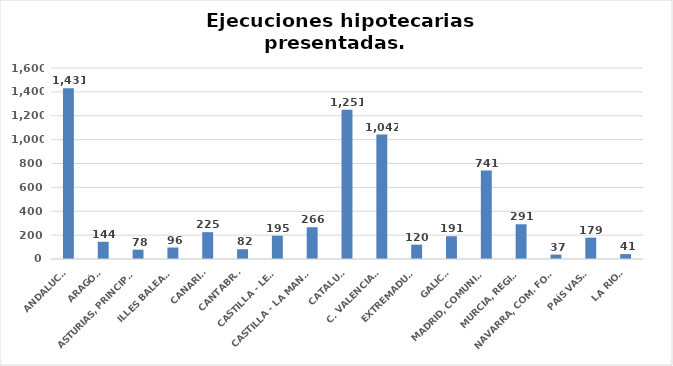
| Category | Series 0 |
|---|---|
| ANDALUCÍA | 1431 |
| ARAGÓN | 144 |
| ASTURIAS, PRINCIPADO | 78 |
| ILLES BALEARS | 96 |
| CANARIAS | 225 |
| CANTABRIA | 82 |
| CASTILLA - LEÓN | 195 |
| CASTILLA - LA MANCHA | 266 |
| CATALUÑA | 1251 |
| C. VALENCIANA | 1042 |
| EXTREMADURA | 120 |
| GALICIA | 191 |
| MADRID, COMUNIDAD | 741 |
| MURCIA, REGIÓN | 291 |
| NAVARRA, COM. FORAL | 37 |
| PAÍS VASCO | 179 |
| LA RIOJA | 41 |